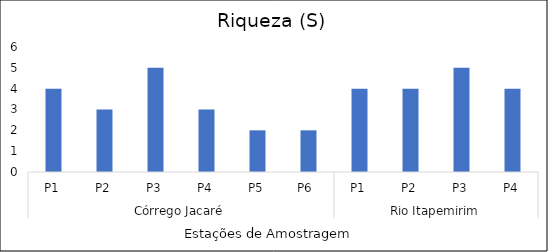
| Category | Series 0 |
|---|---|
| 0 | 4 |
| 1 | 3 |
| 2 | 5 |
| 3 | 3 |
| 4 | 2 |
| 5 | 2 |
| 6 | 4 |
| 7 | 4 |
| 8 | 5 |
| 9 | 4 |